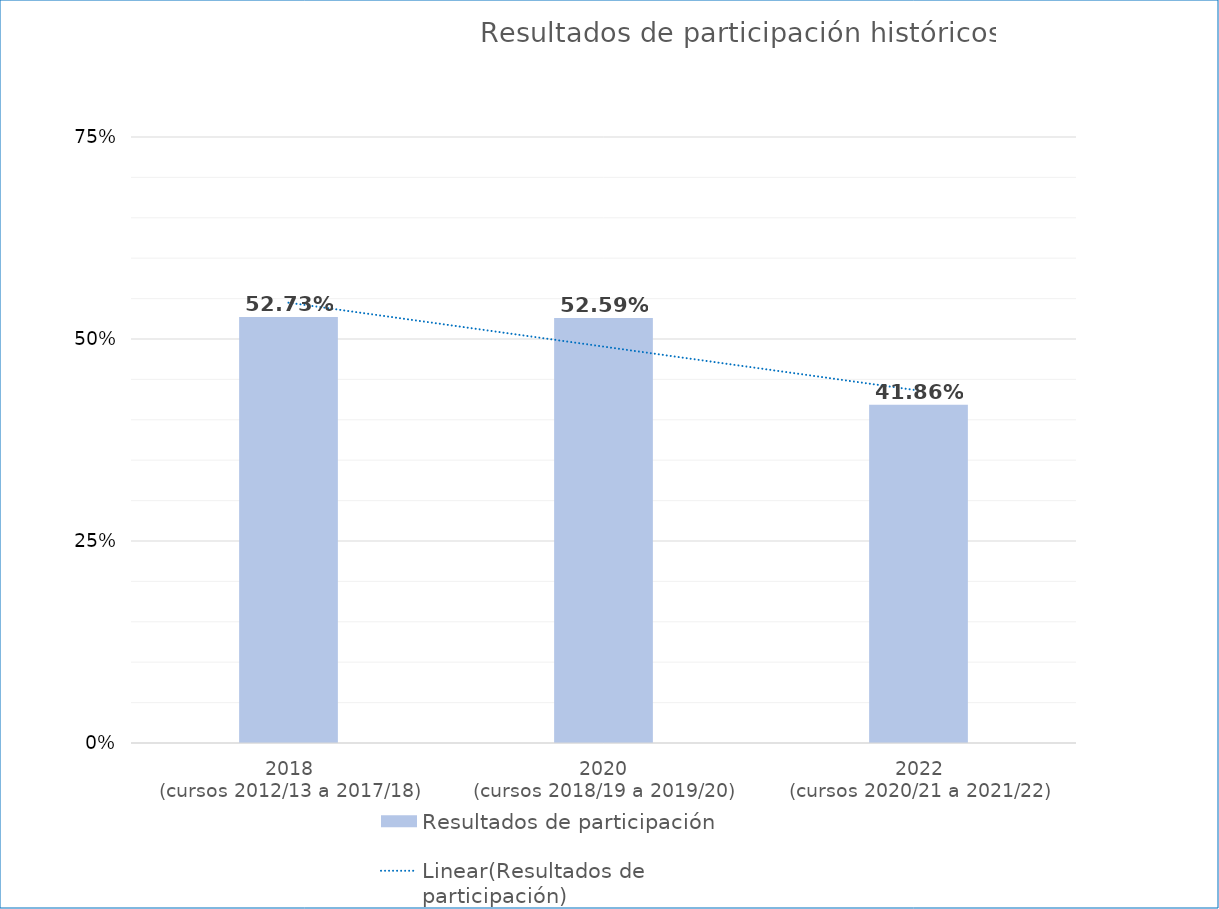
| Category | Resultados de participación |
|---|---|
| 2018
(cursos 2012/13 a 2017/18) | 0.527 |
| 2020
(cursos 2018/19 a 2019/20) | 0.526 |
| 2022
(cursos 2020/21 a 2021/22) | 0.419 |